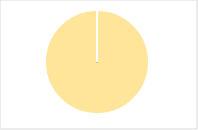
| Category | Total |
|---|---|
| Y | 0 |
| R | 0 |
| T | 0 |
| M | 0 |
| F | 0 |
| N | 1029 |